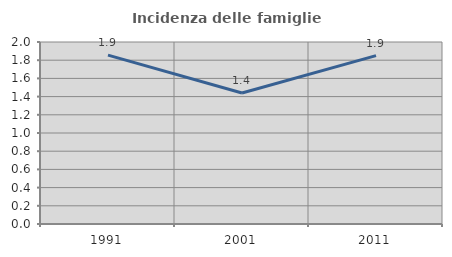
| Category | Incidenza delle famiglie numerose |
|---|---|
| 1991.0 | 1.855 |
| 2001.0 | 1.44 |
| 2011.0 | 1.85 |